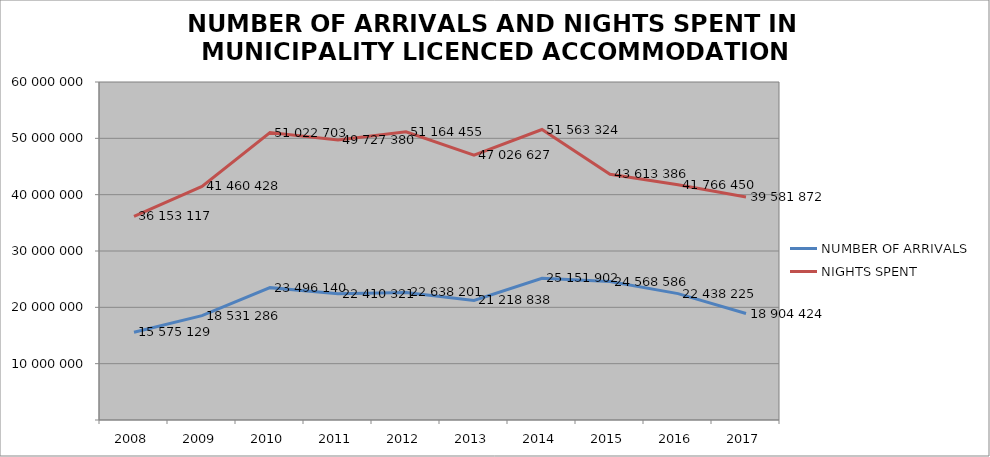
| Category | NUMBER OF ARRIVALS | NIGHTS SPENT |
|---|---|---|
| 2008 | 15575129 | 36153117 |
| 2009 | 18531286 | 41460428 |
| 2010 | 23496140 | 51022703 |
| 2011 | 22410321 | 49727380 |
| 2012 | 22638201 | 51164455 |
| 2013 | 21218838 | 47026627 |
| 2014 | 25151902 | 51563324 |
| 2015 | 24568586 | 43613386 |
| 2016 | 22438225 | 41766450 |
| 2017 | 18904424 | 39581872 |